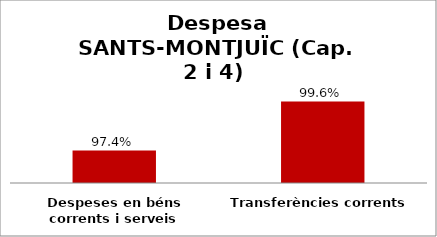
| Category | Series 0 |
|---|---|
| Despeses en béns corrents i serveis | 0.974 |
| Transferències corrents | 0.996 |